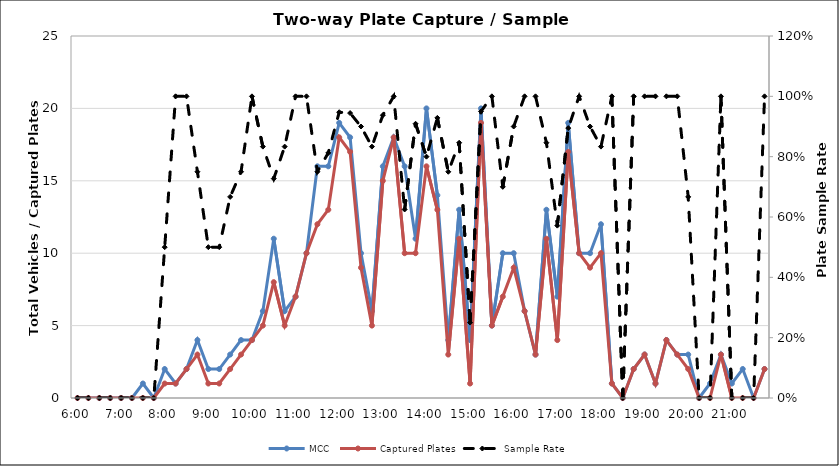
| Category | MCC | Captured Plates |
|---|---|---|
| 0.25 | 0 | 0 |
| 0.260416666666667 | 0 | 0 |
| 0.270833333333333 | 0 | 0 |
| 0.28125 | 0 | 0 |
| 0.291666666666667 | 0 | 0 |
| 0.302083333333333 | 0 | 0 |
| 0.3125 | 1 | 0 |
| 0.322916666666667 | 0 | 0 |
| 0.333333333333333 | 2 | 1 |
| 0.34375 | 1 | 1 |
| 0.354166666666667 | 2 | 2 |
| 0.364583333333333 | 4 | 3 |
| 0.375 | 2 | 1 |
| 0.385416666666667 | 2 | 1 |
| 0.395833333333333 | 3 | 2 |
| 0.40625 | 4 | 3 |
| 0.416666666666667 | 4 | 4 |
| 0.427083333333333 | 6 | 5 |
| 0.4375 | 11 | 8 |
| 0.447916666666667 | 6 | 5 |
| 0.458333333333333 | 7 | 7 |
| 0.46875 | 10 | 10 |
| 0.479166666666667 | 16 | 12 |
| 0.489583333333333 | 16 | 13 |
| 0.5 | 19 | 18 |
| 0.510416666666667 | 18 | 17 |
| 0.520833333333333 | 10 | 9 |
| 0.53125 | 6 | 5 |
| 0.541666666666667 | 16 | 15 |
| 0.552083333333333 | 18 | 18 |
| 0.5625 | 16 | 10 |
| 0.572916666666667 | 11 | 10 |
| 0.583333333333333 | 20 | 16 |
| 0.59375 | 14 | 13 |
| 0.604166666666667 | 4 | 3 |
| 0.614583333333333 | 13 | 11 |
| 0.625 | 4 | 1 |
| 0.635416666666667 | 20 | 19 |
| 0.645833333333333 | 5 | 5 |
| 0.65625 | 10 | 7 |
| 0.666666666666667 | 10 | 9 |
| 0.677083333333333 | 6 | 6 |
| 0.6875 | 3 | 3 |
| 0.697916666666667 | 13 | 11 |
| 0.708333333333333 | 7 | 4 |
| 0.71875 | 19 | 17 |
| 0.729166666666667 | 10 | 10 |
| 0.739583333333333 | 10 | 9 |
| 0.75 | 12 | 10 |
| 0.760416666666667 | 1 | 1 |
| 0.770833333333333 | 0 | 0 |
| 0.78125 | 2 | 2 |
| 0.791666666666667 | 3 | 3 |
| 0.802083333333333 | 1 | 1 |
| 0.8125 | 4 | 4 |
| 0.822916666666667 | 3 | 3 |
| 0.833333333333333 | 3 | 2 |
| 0.84375 | 0 | 0 |
| 0.854166666666667 | 1 | 0 |
| 0.864583333333333 | 3 | 3 |
| 0.875 | 1 | 0 |
| 0.885416666666667 | 2 | 0 |
| 0.895833333333333 | 0 | 0 |
| 0.90625 | 2 | 2 |